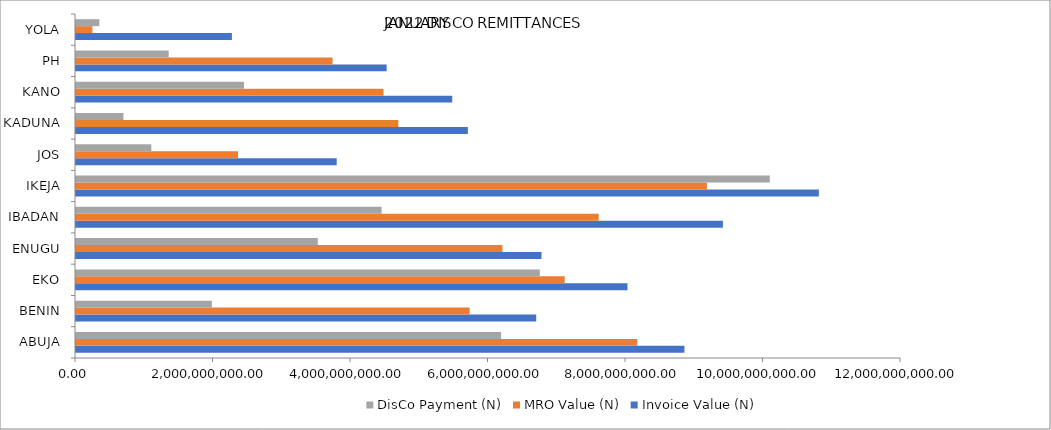
| Category | Invoice Value (N) | MRO Value (N) | DisCo Payment (N) |
|---|---|---|---|
| ABUJA | 8849882420.983 | 8164016533.357 | 6183705542.67 |
| BENIN | 6693883561.886 | 5725947998.837 | 1975522657.82 |
| EKO | 8021173179.374 | 7108363671.561 | 6745806643.85 |
| ENUGU | 6771331778.117 | 6202539908.755 | 3516938211.45 |
| IBADAN | 9410018929.832 | 7602354293.411 | 4445135340.7 |
| IKEJA | 10805012703.464 | 9176697289.052 | 10091881865.04 |
| JOS | 3792050570.696 | 2357517839.802 | 1095547489.89 |
| KADUNA | 5699556264.578 | 4688454983.242 | 690164161.11 |
| KANO | 5472642929.41 | 4472791066.207 | 2443751351.9 |
| PH | 4518732527.464 | 3731569321.18 | 1348438470.87 |
| YOLA | 2267479157.358 | 238085311.523 | 339529605.8 |